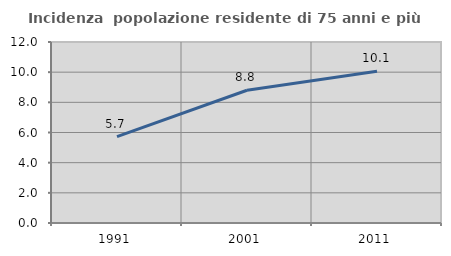
| Category | Incidenza  popolazione residente di 75 anni e più |
|---|---|
| 1991.0 | 5.725 |
| 2001.0 | 8.801 |
| 2011.0 | 10.055 |